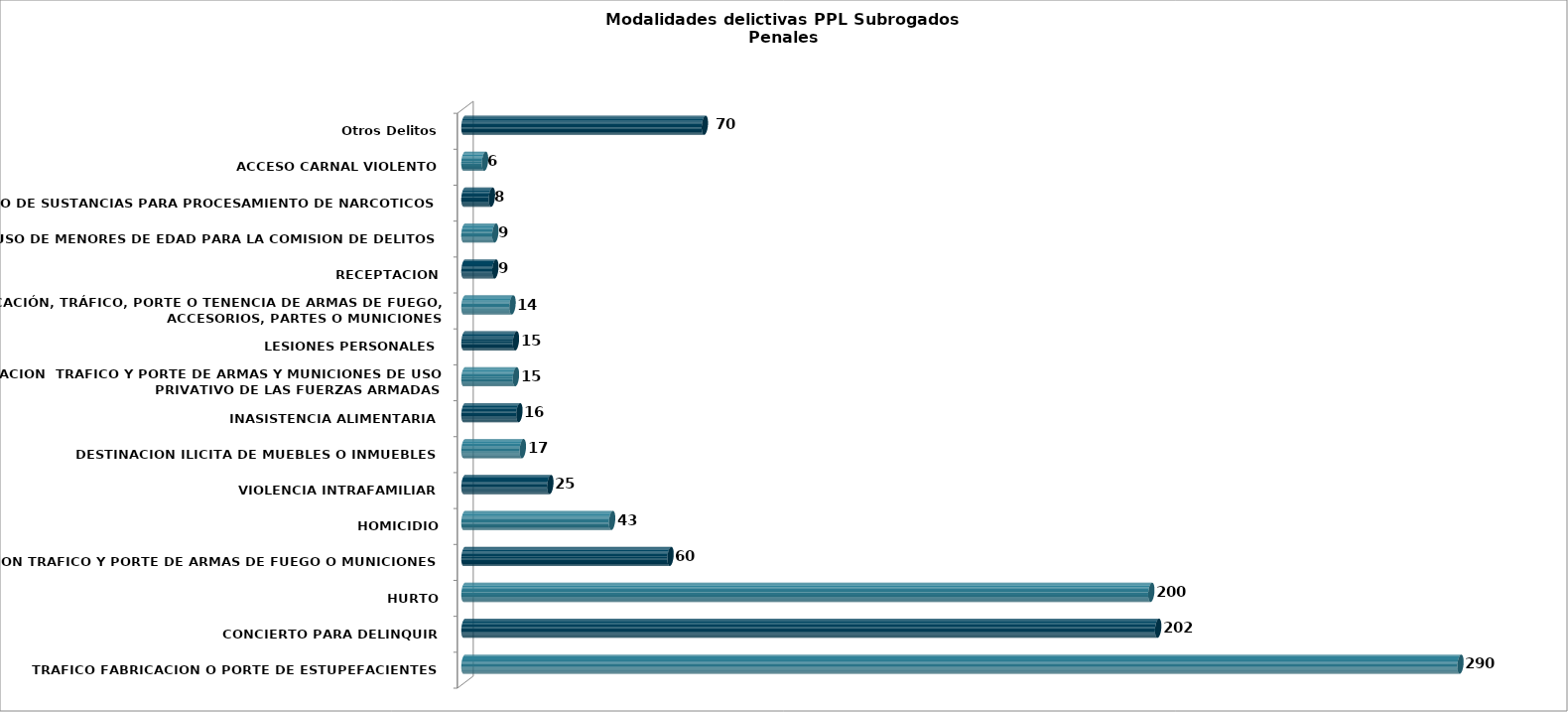
| Category | Series 0 |
|---|---|
| TRAFICO FABRICACION O PORTE DE ESTUPEFACIENTES | 290 |
| CONCIERTO PARA DELINQUIR | 202 |
| HURTO | 200 |
| FABRICACION TRAFICO Y PORTE DE ARMAS DE FUEGO O MUNICIONES | 60 |
| HOMICIDIO | 43 |
| VIOLENCIA INTRAFAMILIAR | 25 |
| DESTINACION ILICITA DE MUEBLES O INMUEBLES | 17 |
| INASISTENCIA ALIMENTARIA | 16 |
| FABRICACION  TRAFICO Y PORTE DE ARMAS Y MUNICIONES DE USO PRIVATIVO DE LAS FUERZAS ARMADAS | 15 |
| LESIONES PERSONALES | 15 |
| FABRICACIÓN, TRÁFICO, PORTE O TENENCIA DE ARMAS DE FUEGO, ACCESORIOS, PARTES O MUNICIONES | 14 |
| RECEPTACION | 9 |
| USO DE MENORES DE EDAD PARA LA COMISION DE DELITOS | 9 |
| TRAFICO DE SUSTANCIAS PARA PROCESAMIENTO DE NARCOTICOS | 8 |
| ACCESO CARNAL VIOLENTO | 6 |
| Otros Delitos | 70 |